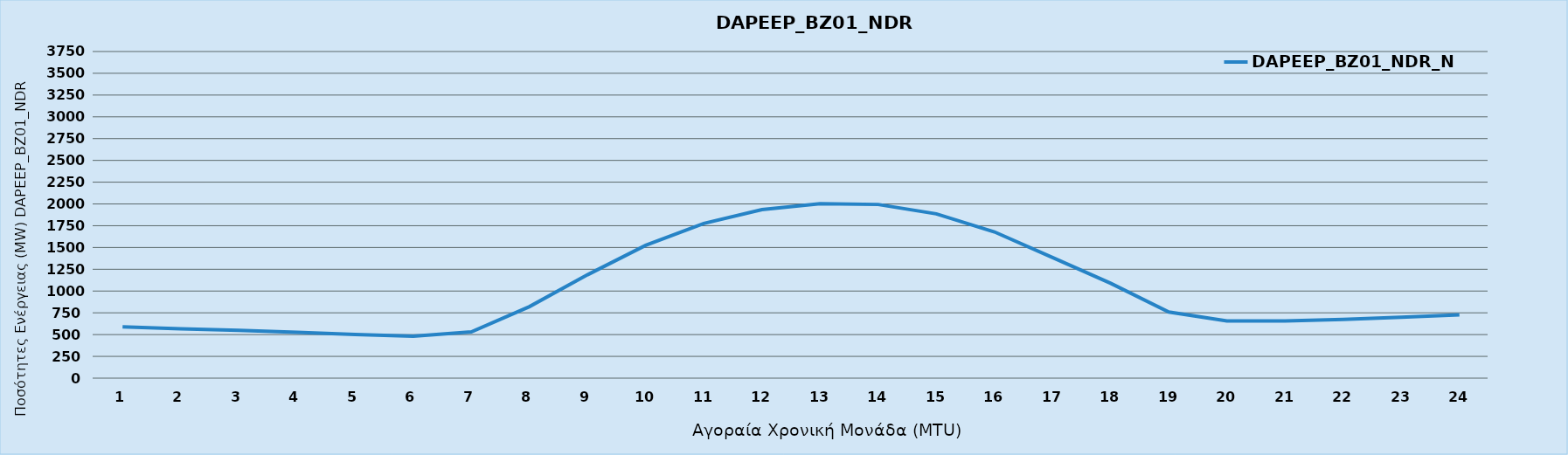
| Category | DAPEEP_BZ01_NDR_N1 |
|---|---|
| 0 | 588 |
| 1 | 566 |
| 2 | 549 |
| 3 | 527 |
| 4 | 502 |
| 5 | 482 |
| 6 | 531 |
| 7 | 821 |
| 8 | 1187 |
| 9 | 1525 |
| 10 | 1776 |
| 11 | 1935 |
| 12 | 2002 |
| 13 | 1994 |
| 14 | 1886 |
| 15 | 1679 |
| 16 | 1385 |
| 17 | 1089 |
| 18 | 759 |
| 19 | 656 |
| 20 | 656 |
| 21 | 674 |
| 22 | 699 |
| 23 | 726 |